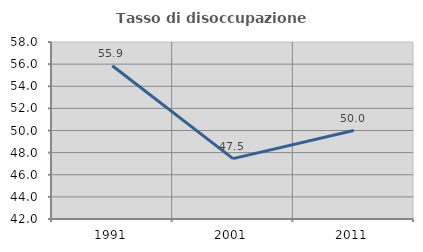
| Category | Tasso di disoccupazione giovanile  |
|---|---|
| 1991.0 | 55.856 |
| 2001.0 | 47.458 |
| 2011.0 | 50 |